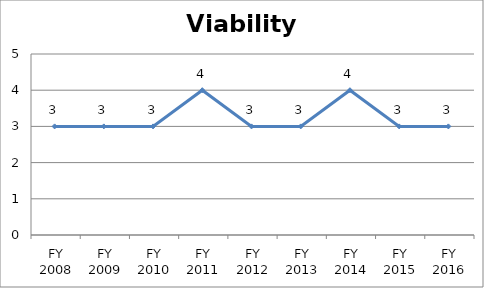
| Category | Viability score |
|---|---|
| FY 2016 | 3 |
| FY 2015 | 3 |
| FY 2014 | 4 |
| FY 2013 | 3 |
| FY 2012 | 3 |
| FY 2011 | 4 |
| FY 2010 | 3 |
| FY 2009 | 3 |
| FY 2008 | 3 |